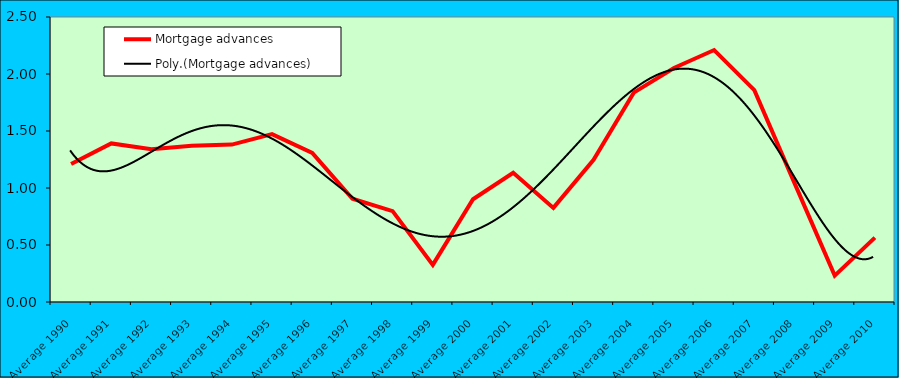
| Category | Mortgage advances |
|---|---|
| Average 1990 | 1.211 |
| Average 1991 | 1.391 |
| Average 1992 | 1.34 |
| Average 1993 | 1.371 |
| Average 1994 | 1.381 |
| Average 1995 | 1.473 |
| Average 1996 | 1.307 |
| Average 1997 | 0.906 |
| Average 1998 | 0.797 |
| Average 1999 | 0.326 |
| Average 2000 | 0.901 |
| Average 2001 | 1.133 |
| Average 2002 | 0.825 |
| Average 2003 | 1.247 |
| Average 2004 | 1.836 |
| Average 2005 | 2.053 |
| Average 2006 | 2.21 |
| Average 2007 | 1.858 |
| Average 2008 | 1.043 |
| Average 2009 | 0.232 |
| Average 2010 | 0.565 |